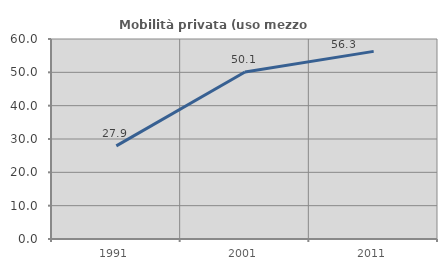
| Category | Mobilità privata (uso mezzo privato) |
|---|---|
| 1991.0 | 27.934 |
| 2001.0 | 50.097 |
| 2011.0 | 56.288 |